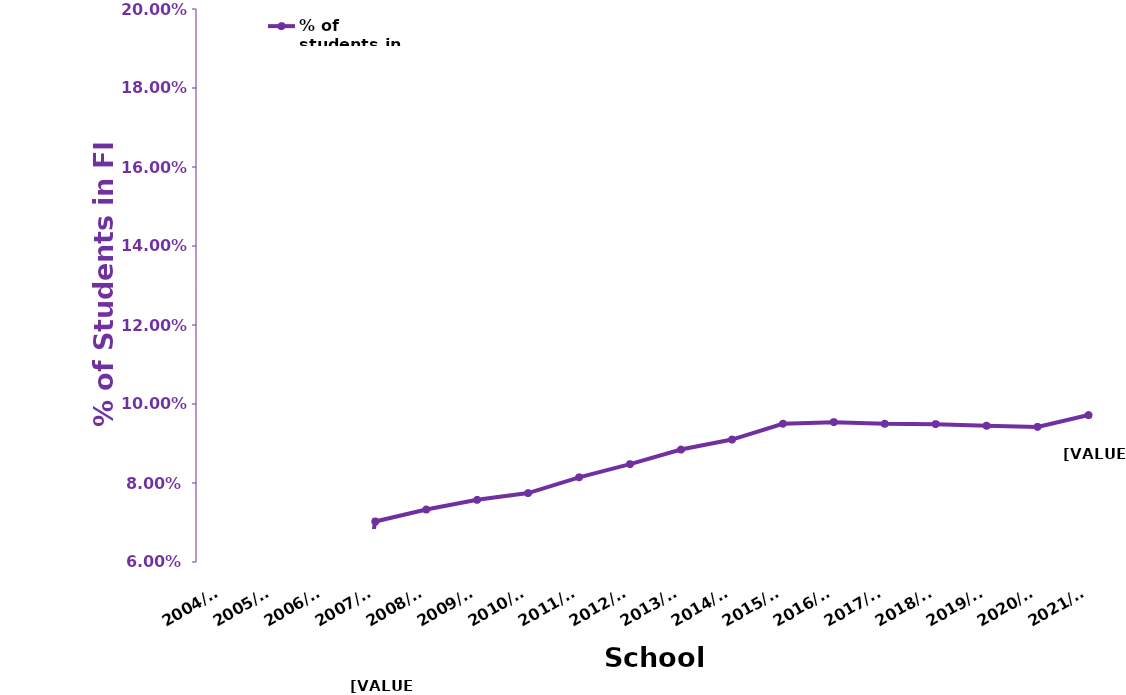
| Category | % of students in FI |
|---|---|
| 2004/05 | 0 |
| 2005/06 | 0 |
| 2006/07 | 0 |
| 2007/08 | 0.07 |
| 2008/09 | 0.073 |
| 2009/10 | 0.076 |
| 2010/11 | 0.077 |
| 2011/12 | 0.081 |
| 2012/13 | 0.085 |
| 2013/14 | 0.088 |
| 2014/15 | 0.091 |
| 2015/16 | 0.095 |
| 2016/17 | 0.095 |
| 2017/18 | 0.095 |
| 2018/19 | 0.095 |
| 2019/20 | 0.094 |
| 2020/21 | 0.094 |
| 2021/22 | 0.097 |